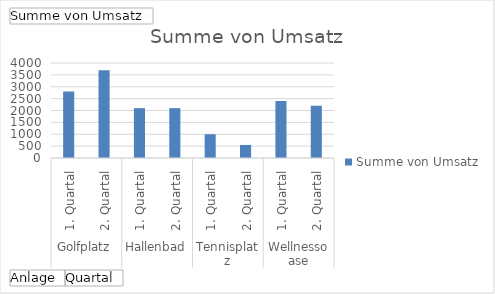
| Category | Ergebnis |
|---|---|
| 0 | 2800 |
| 1 | 3700 |
| 2 | 2100 |
| 3 | 2100 |
| 4 | 1000 |
| 5 | 550 |
| 6 | 2400 |
| 7 | 2200 |